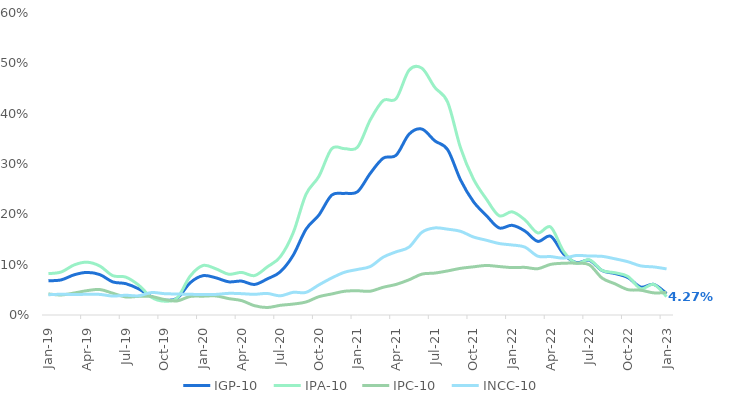
| Category | IGP-10 | IPA-10 | IPC-10 | INCC-10 |
|---|---|---|---|---|
| 2019-01-01 | 0.068 | 0.082 | 0.042 | 0.04 |
| 2019-02-01 | 0.07 | 0.086 | 0.04 | 0.041 |
| 2019-03-01 | 0.08 | 0.1 | 0.044 | 0.041 |
| 2019-04-01 | 0.085 | 0.105 | 0.048 | 0.041 |
| 2019-05-01 | 0.08 | 0.097 | 0.051 | 0.041 |
| 2019-06-01 | 0.066 | 0.078 | 0.043 | 0.038 |
| 2019-07-01 | 0.062 | 0.075 | 0.036 | 0.039 |
| 2019-08-01 | 0.052 | 0.06 | 0.037 | 0.038 |
| 2019-09-01 | 0.036 | 0.035 | 0.037 | 0.045 |
| 2019-10-01 | 0.03 | 0.028 | 0.031 | 0.042 |
| 2019-11-01 | 0.033 | 0.034 | 0.028 | 0.042 |
| 2019-12-01 | 0.064 | 0.077 | 0.037 | 0.041 |
| 2020-01-01 | 0.078 | 0.098 | 0.037 | 0.041 |
| 2020-02-01 | 0.074 | 0.092 | 0.038 | 0.041 |
| 2020-03-01 | 0.066 | 0.081 | 0.033 | 0.043 |
| 2020-04-01 | 0.067 | 0.085 | 0.029 | 0.042 |
| 2020-05-01 | 0.061 | 0.078 | 0.018 | 0.041 |
| 2020-06-01 | 0.072 | 0.096 | 0.015 | 0.043 |
| 2020-07-01 | 0.086 | 0.116 | 0.019 | 0.038 |
| 2020-08-01 | 0.118 | 0.163 | 0.022 | 0.045 |
| 2020-09-01 | 0.17 | 0.24 | 0.026 | 0.045 |
| 2020-10-01 | 0.198 | 0.275 | 0.036 | 0.06 |
| 2020-11-01 | 0.238 | 0.33 | 0.042 | 0.074 |
| 2020-12-01 | 0.242 | 0.33 | 0.047 | 0.085 |
| 2021-01-01 | 0.245 | 0.333 | 0.048 | 0.09 |
| 2021-02-01 | 0.282 | 0.388 | 0.047 | 0.096 |
| 2021-03-01 | 0.312 | 0.426 | 0.055 | 0.115 |
| 2021-04-01 | 0.317 | 0.43 | 0.061 | 0.126 |
| 2021-05-01 | 0.359 | 0.486 | 0.07 | 0.135 |
| 2021-06-01 | 0.369 | 0.49 | 0.081 | 0.164 |
| 2021-07-01 | 0.346 | 0.452 | 0.083 | 0.173 |
| 2021-08-01 | 0.328 | 0.423 | 0.088 | 0.17 |
| 2021-09-01 | 0.268 | 0.332 | 0.093 | 0.166 |
| 2021-10-01 | 0.225 | 0.27 | 0.096 | 0.155 |
| 2021-11-01 | 0.198 | 0.231 | 0.098 | 0.149 |
| 2021-12-01 | 0.173 | 0.197 | 0.096 | 0.142 |
| 2022-01-01 | 0.178 | 0.205 | 0.094 | 0.139 |
| 2022-02-01 | 0.167 | 0.189 | 0.095 | 0.135 |
| 2022-03-01 | 0.146 | 0.163 | 0.092 | 0.117 |
| 2022-04-01 | 0.156 | 0.175 | 0.101 | 0.116 |
| 2022-05-01 | 0.121 | 0.127 | 0.103 | 0.113 |
| 2022-06-01 | 0.104 | 0.103 | 0.103 | 0.118 |
| 2022-07-01 | 0.109 | 0.11 | 0.1 | 0.117 |
| 2022-08-01 | 0.088 | 0.088 | 0.073 | 0.116 |
| 2022-09-01 | 0.082 | 0.084 | 0.062 | 0.112 |
| 2022-10-01 | 0.074 | 0.077 | 0.05 | 0.106 |
| 2022-11-01 | 0.056 | 0.052 | 0.049 | 0.098 |
| 2022-12-01 | 0.061 | 0.061 | 0.044 | 0.096 |
| 2023-01-01 | 0.043 | 0.037 | 0.045 | 0.092 |